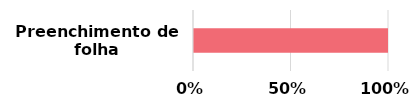
| Category | Series 0 | Series 1 |
|---|---|---|
| Preenchimento de folha | 0 | 1 |